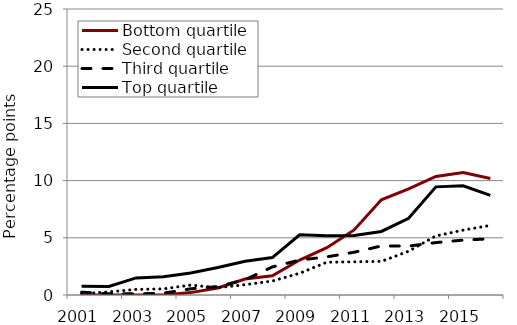
| Category | Bottom quartile | Second quartile | Third quartile | Top quartile |
|---|---|---|---|---|
| 2001.0 | 0 | 0.115 | 0.25 | 0.768 |
| 2002.0 | 0 | 0.275 | 0.108 | 0.753 |
| 2003.0 | 0 | 0.489 | 0.097 | 1.494 |
| 2004.0 | 0 | 0.534 | 0.159 | 1.59 |
| 2005.0 | 0.208 | 0.867 | 0.541 | 1.932 |
| 2006.0 | 0.61 | 0.638 | 0.739 | 2.402 |
| 2007.0 | 1.391 | 0.903 | 1.338 | 2.952 |
| 2008.0 | 1.686 | 1.222 | 2.454 | 3.27 |
| 2009.0 | 3.058 | 1.898 | 3.054 | 5.268 |
| 2010.0 | 4.136 | 2.864 | 3.335 | 5.179 |
| 2011.0 | 5.69 | 2.901 | 3.736 | 5.201 |
| 2012.0 | 8.326 | 2.937 | 4.288 | 5.556 |
| 2013.0 | 9.271 | 3.826 | 4.276 | 6.709 |
| 2014.0 | 10.367 | 5.166 | 4.582 | 9.452 |
| 2015.0 | 10.699 | 5.671 | 4.8 | 9.548 |
| 2016.0 | 10.178 | 6.085 | 4.913 | 8.708 |